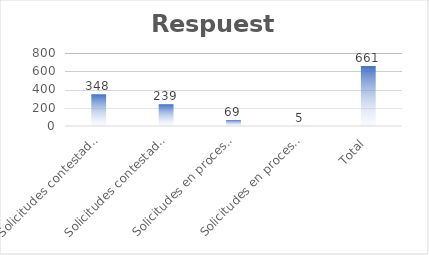
| Category | Respuesta |
|---|---|
| Solicitudes contestadas Físicas | 348 |
| Solicitudes contestadas Portal SAIP | 239 |
| Solicitudes en proceso Fisicas | 69 |
| Solicitudes en proceso SAIP | 5 |
| Total | 661 |